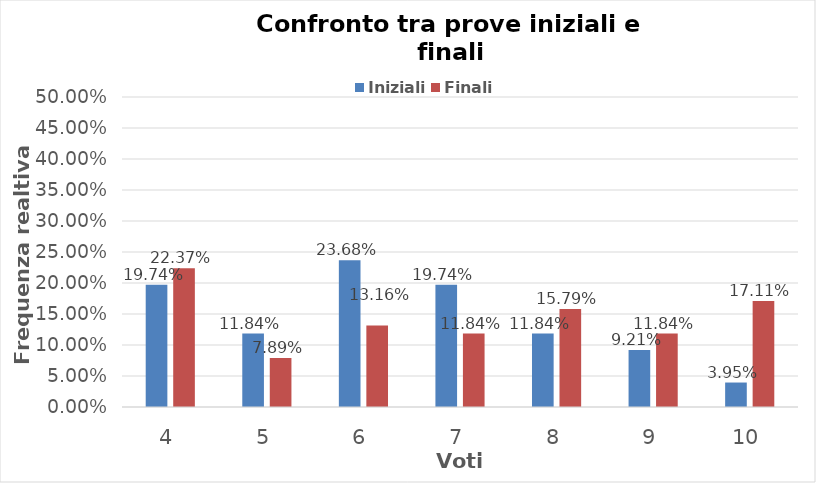
| Category | Iniziali | Finali |
|---|---|---|
| 4.0 | 0.197 | 0.224 |
| 5.0 | 0.118 | 0.079 |
| 6.0 | 0.237 | 0.132 |
| 7.0 | 0.197 | 0.118 |
| 8.0 | 0.118 | 0.158 |
| 9.0 | 0.092 | 0.118 |
| 10.0 | 0.039 | 0.171 |